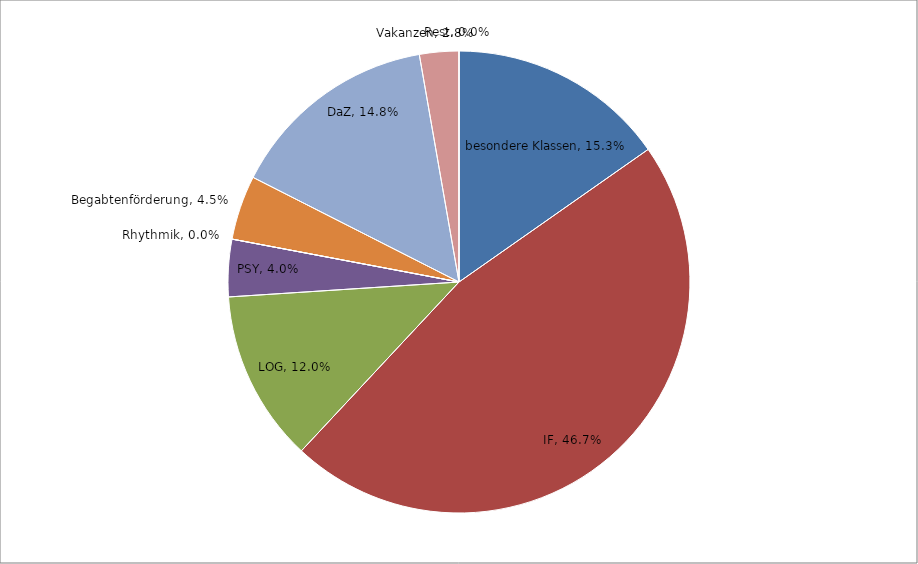
| Category | Series 0 |
|---|---|
| besondere Klassen | 0.153 |
| IF | 0.467 |
| LOG | 0.12 |
| PSY | 0.04 |
| Rhythmik | 0 |
| Begabtenförderung | 0.045 |
| DaZ | 0.148 |
| Vakanzen | 0.028 |
| Rest | 0 |